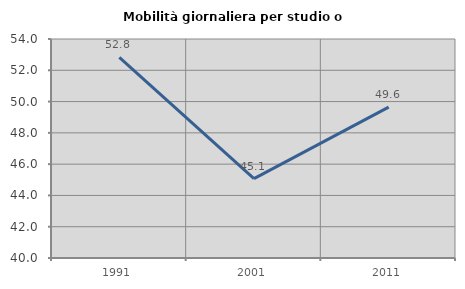
| Category | Mobilità giornaliera per studio o lavoro |
|---|---|
| 1991.0 | 52.823 |
| 2001.0 | 45.076 |
| 2011.0 | 49.647 |